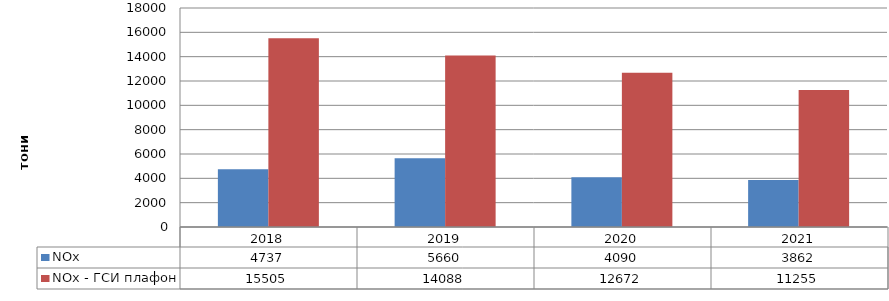
| Category | NОx | NOx - ГСИ плафон |
|---|---|---|
| 2018.0 | 4737.49 | 15505 |
| 2019.0 | 5659.74 | 14088 |
| 2020.0 | 4090.1 | 12672 |
| 2021.0 | 3861.69 | 11255 |